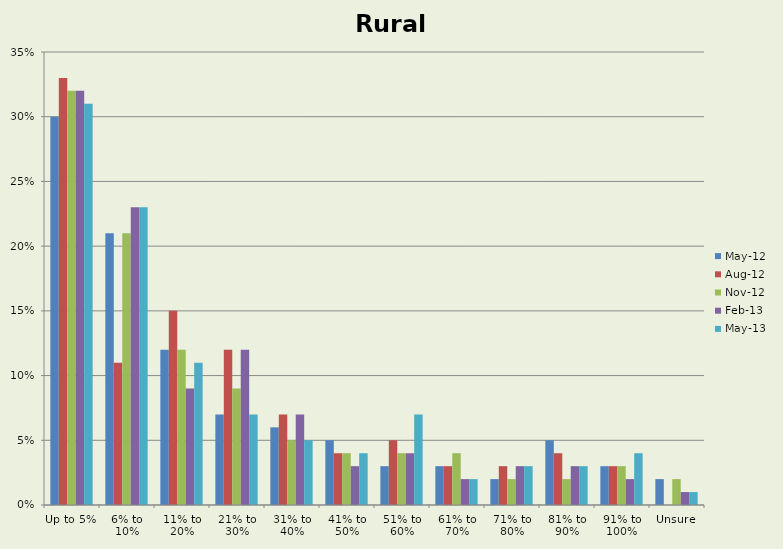
| Category | May-12 | Aug-12 | Nov-12 | Feb-13 | May-13 |
|---|---|---|---|---|---|
| Up to 5%  | 0.3 | 0.33 | 0.32 | 0.32 | 0.31 |
| 6% to 10% | 0.21 | 0.11 | 0.21 | 0.23 | 0.23 |
| 11% to 20% | 0.12 | 0.15 | 0.12 | 0.09 | 0.11 |
| 21% to 30% | 0.07 | 0.12 | 0.09 | 0.12 | 0.07 |
| 31% to 40% | 0.06 | 0.07 | 0.05 | 0.07 | 0.05 |
| 41% to 50% | 0.05 | 0.04 | 0.04 | 0.03 | 0.04 |
| 51% to 60% | 0.03 | 0.05 | 0.04 | 0.04 | 0.07 |
| 61% to 70% | 0.03 | 0.03 | 0.04 | 0.02 | 0.02 |
| 71% to 80% | 0.02 | 0.03 | 0.02 | 0.03 | 0.03 |
| 81% to 90% | 0.05 | 0.04 | 0.02 | 0.03 | 0.03 |
| 91% to 100% | 0.03 | 0.03 | 0.03 | 0.02 | 0.04 |
| Unsure | 0.02 | 0 | 0.02 | 0.01 | 0.01 |